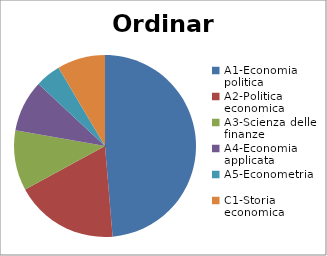
| Category | Ordinari | Series 1 |
|---|---|---|
| A1-Economia politica | 291 |  |
| A2-Politica economica | 110 |  |
| A3-Scienza delle finanze | 64 |  |
| A4-Economia applicata | 55 |  |
| A5-Econometria | 27 |  |
| C1-Storia economica | 51 |  |